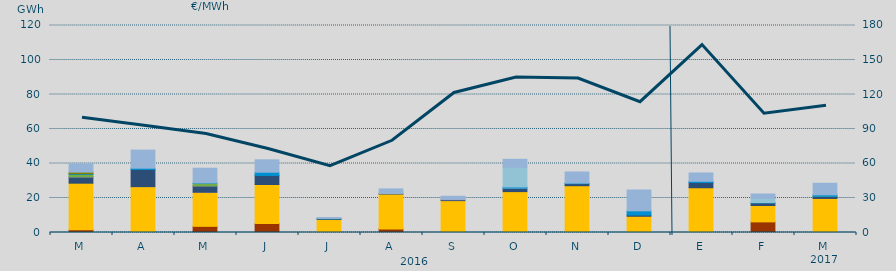
| Category | Carbón | Ciclo Combinado | Cogeneración | Consumo Bombeo | Enlace Península Baleares | Eólica | Hidráulica | Internacionales | Otras Renovables | Residuos no Renovables | Solar fotovoltaica | Solar térmica | Turbinación bombeo |
|---|---|---|---|---|---|---|---|---|---|---|---|---|---|
| M | 1586.3 | 26999.7 | 0 | 3618.7 | 83.2 | 1329.1 | 426.3 | 0 | 952.9 | 0 | 0 | 0 | 4767 |
| A | 576.5 | 26003.6 | 0 | 9984.7 | 0 | 0 | 727.3 | 0 | 0 | 0 | 0 | 0 | 10463.6 |
| M | 3569.6 | 19753.8 | 10.4 | 3695 | 26 | 1500 | 196.5 | 0 | 0 | 0 | 0 | 0 | 8519.5 |
| J | 5205 | 22612.8 | 0 | 5244.3 | 0 | 0 | 1878.6 | 0 | 0 | 0 | 0 | 0 | 7187.7 |
| J | 210 | 7404.2 | 0 | 326.1 | 0 | 0 | 195.5 | 0 | 0 | 0 | 0 | 0 | 525.8 |
| A | 2091.8 | 20206 | 0 | 273.8 | 0 | 0 | 0 | 0 | 0 | 0 | 0 | 0 | 2688.1 |
| S | 456.3 | 18024.6 | 0 | 521.1 | 279.8 | 0 | 0 | 0 | 0 | 0 | 0 | 0 | 1707.9 |
| O | 53.4 | 23642.3 | 0 | 1821.5 | 200.8 | 0 | 661 | 11465.7 | 0 | 0 | 0 | 0 | 4580.4 |
| N | 0 | 27130.5 | 0 | 1183.5 | 0 | 0 | 312.1 | 0 | 0 | 0 | 0 | 0 | 6456 |
| D | 0 | 9410.5 | 0 | 701.1 | 0 | 0 | 2449.9 | 0 | 0 | 0 | 0 | 0 | 12070.5 |
| E | 0 | 25945.3 | 0 | 3031.3 | 0 | 0 | 733.3 | 0 | 0 | 0 | 0 | 0 | 4804 |
| F | 6150 | 9508.4 | 0 | 1469.4 | 0 | 0 | 198 | 2463.6 | 0 | 0 | 0 | 0 | 2519.7 |
| M | 0 | 19740.7 | 0 | 1177.9 | 20.4 | 43.7 | 849.6 | 0 | 0 | 0 | 0 | 0 | 6709.7 |